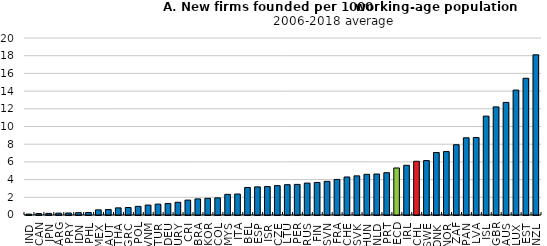
| Category | New entry rate |
|---|---|
| IND | 0.102 |
| CAN | 0.161 |
| JPN | 0.183 |
| ARG | 0.208 |
| PRY | 0.228 |
| IDN | 0.26 |
| PHL | 0.286 |
| MEX | 0.577 |
| AUT | 0.625 |
| THA | 0.806 |
| GRC | 0.846 |
| POL | 0.975 |
| VNM | 1.122 |
| TUR | 1.229 |
| DEU | 1.297 |
| URY | 1.438 |
| CRI | 1.681 |
| BRA | 1.82 |
| KOR | 1.887 |
| COL | 1.937 |
| MYS | 2.331 |
| ITA | 2.368 |
| BEL | 3.109 |
| ESP | 3.179 |
| ISR | 3.212 |
| CZE | 3.316 |
| LTU | 3.424 |
| PER | 3.457 |
| RUS | 3.606 |
| FIN | 3.676 |
| SVN | 3.801 |
| FRA | 4.021 |
| CHE | 4.295 |
| SVK | 4.421 |
| HUN | 4.596 |
| NLD | 4.631 |
| PRT | 4.778 |
| OECD | 5.313 |
| IRL | 5.614 |
| CHL | 6.071 |
| SWE | 6.151 |
| DNK | 7.063 |
| NOR | 7.165 |
| ZAF | 7.94 |
| PAN | 8.722 |
| LVA | 8.754 |
| ISL | 11.173 |
| GBR | 12.215 |
| AUS | 12.723 |
| LUX | 14.114 |
| EST | 15.45 |
| NZL | 18.1 |